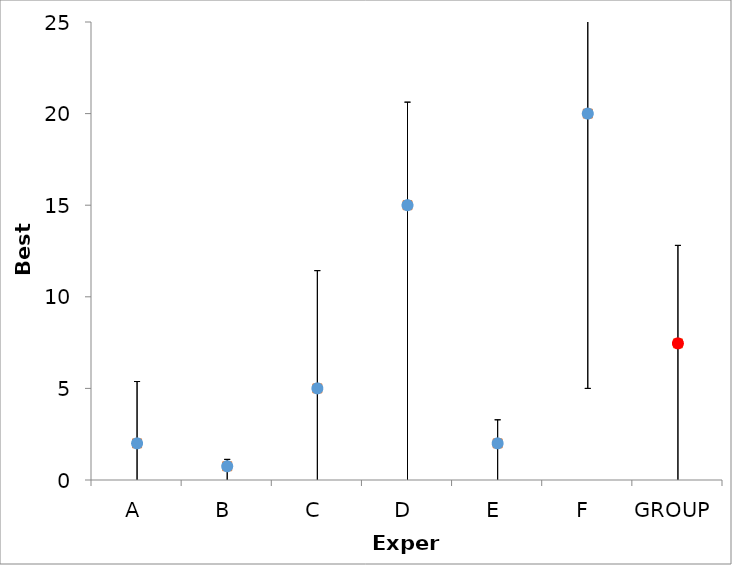
| Category | Series 1 | Series 0 |
|---|---|---|
| A | 2 | 2 |
| B | 0.75 | 0.75 |
| C | 5 | 5 |
| D | 15 | 15 |
| E | 2 | 2 |
| F | 20 | 20 |
| GROUP | 7.458 | 7.458 |